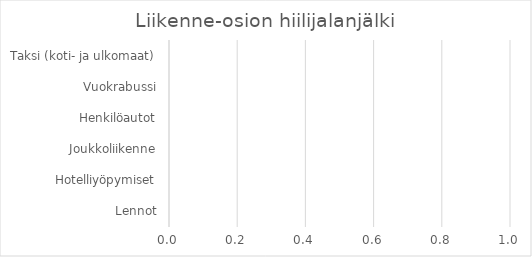
| Category | Infra-osion hiilijalanjälki, Jätteenkäsittely |
|---|---|
| Sekajäte | 0 |
| Energiajäte | 0 |
| Biojäte | 0 |
| Kartonki & Pahvi | 0 |
| Lasi | 0 |
| Metalli | 0 |
| Muovi | 0 |
| Paperi | 0 |
| Sähkölaiteet (kierrätykseen) | 0 |
| Ongelmajäte | 0 |